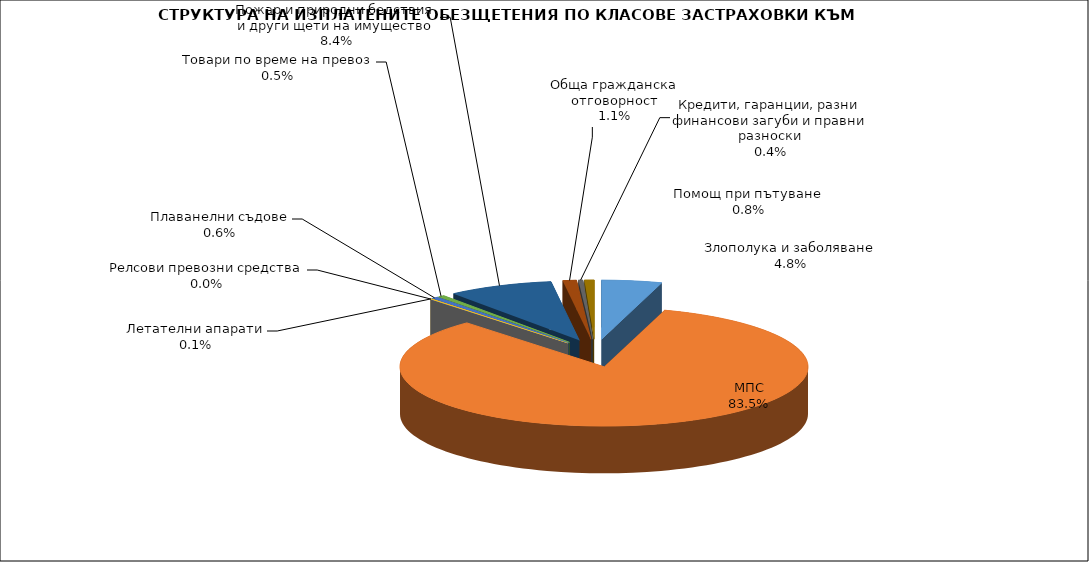
| Category | Series 0 |
|---|---|
| Злополука и заболяване | 0.048 |
| МПС | 0.835 |
| Релсови превозни средства | 0 |
| Летателни апарати | 0.001 |
| Плаванелни съдове | 0.006 |
| Товари по време на превоз | 0.005 |
| Пожар и природни бедствия и други щети на имущество | 0.084 |
| Обща гражданска отговорност | 0.011 |
| Кредити, гаранции, разни финансови загуби и правни разноски | 0.004 |
| Помощ при пътуване | 0.008 |